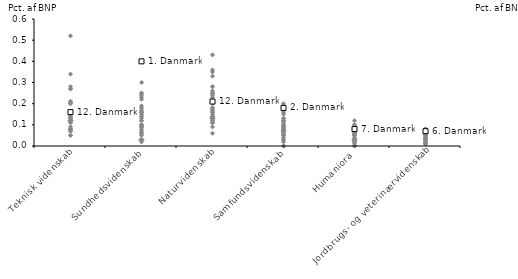
| Category | Argentina | Australien | Belgien | Chile | England | Estland | Finland | Grækenland | Holland | Irland | Island | Israel | Italien | Japan | Luxemburg | Norge | Polen | Portugal | Rumænien | Russiske Føderation | Schweiz | Singapore | Slovakiet | Slovenien | Spanien | Sverige | Sydafrikanske Republik | Sydkorea | Taiwan | Tjekkiet | Tyrkiet | Tyskland | Ungarn | Østrig | Danmark |
|---|---|---|---|---|---|---|---|---|---|---|---|---|---|---|---|---|---|---|---|---|---|---|---|---|---|---|---|---|---|---|---|---|---|---|---|
| Teknisk videnskab | 0.12 | 0.12 | 0.2 | 0.05 | 0.08 | 0.13 | 0.27 | 0.13 | 0.16 | 0.07 | 0.21 | 0.08 | 0.09 | 0.27 | 0.13 | 0.11 | 0.08 | 0.15 | 0.07 | 0.21 | 0.13 | 0.34 | 0.15 | 0.11 | 0.14 | 0.15 | 0.08 | 0.52 | 0.28 | 0.2 | 0.13 | 0.21 | 0.05 | 0.14 | 0.16 |
| Sundhedsvidenskab | 0.03 | 0.25 | 0.16 | 0.03 | 0.12 | 0.15 | 0.17 | 0.1 | 0.24 | 0.09 | 0.19 | 0.06 | 0.12 | 0.18 | 0.09 | 0.23 | 0.06 | 0.1 | 0.02 | 0.03 | 0.16 | 0.25 | 0.07 | 0.05 | 0.13 | 0.3 | 0.06 | 0.1 | 0.14 | 0.09 | 0.14 | 0.16 | 0.08 | 0.22 | 0.4 |
| Naturvidenskab | 0.13 | 0.28 | 0.15 | 0.11 | 0.12 | 0.33 | 0.25 | 0.09 | 0.17 | 0.11 | 0.36 | 0.28 | 0.18 | 0.14 | 0.18 | 0.16 | 0.14 | 0.2 | 0.11 | 0.17 | 0.24 | 0.13 | 0.14 | 0.26 | 0.12 | 0.23 | 0.11 | 0.13 | 0.13 | 0.43 | 0.06 | 0.35 | 0.16 | 0.25 | 0.21 |
| Samfundsvidenskab | 0.07 | 0.12 | 0.09 | 0.03 | 0.11 | 0.09 | 0.2 | 0.07 | 0.15 | 0.05 | 0.16 | 0.06 | 0.1 | 0 | 0.12 | 0.18 | 0.05 | 0.12 | 0.02 | 0.03 | 0.12 | 0 | 0.09 | 0.08 | 0.1 | 0.13 | 0.08 | 0.08 | 0.05 | 0.06 | 0.1 | 0.07 | 0.04 | 0.13 | 0.18 |
| Humaniora | 0.03 | 0.03 | 0.05 | 0.01 | 0.1 | 0.08 | 0.06 | 0.12 | 0.06 | 0.03 | 0.08 | 0.06 | 0.06 | 0 | 0.06 | 0.06 | 0.03 | 0.09 | 0.02 | 0.02 | 0.05 | 0 | 0.06 | 0.07 | 0.06 | 0.05 | 0.02 | 0.03 | 0.03 | 0.06 | 0.05 | 0.1 | 0.04 | 0.09 | 0.08 |
| Jordbrugs- og veterinærvidenskab | 0.06 | 0.08 | 0.07 | 0.03 | 0.02 | 0.04 | 0.08 | 0.03 | 0.08 | 0.05 | 0.04 | 0.02 | 0.04 | 0.07 | 0.01 | 0.05 | 0.01 | 0.03 | 0.03 | 0.02 | 0.02 | 0.01 | 0.06 | 0.05 | 0.04 | 0.03 | 0.04 | 0.07 | 0.06 | 0.03 | 0.04 | 0.04 | 0.04 | 0.04 | 0.07 |